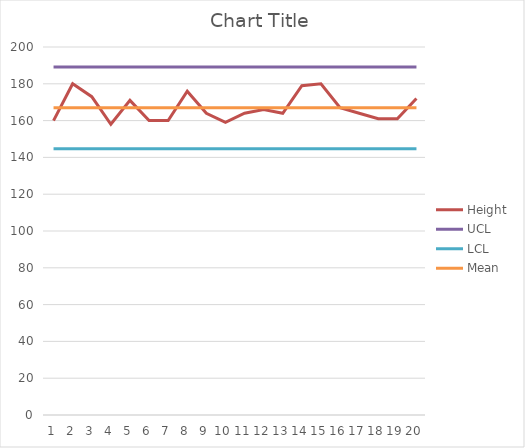
| Category | Height | UCL | LCL | Mean |
|---|---|---|---|---|
| 0 | 160 | 189.155 | 144.745 | 166.95 |
| 1 | 180 | 189.155 | 144.745 | 166.95 |
| 2 | 173 | 189.155 | 144.745 | 166.95 |
| 3 | 158 | 189.155 | 144.745 | 166.95 |
| 4 | 171 | 189.155 | 144.745 | 166.95 |
| 5 | 160 | 189.155 | 144.745 | 166.95 |
| 6 | 160 | 189.155 | 144.745 | 166.95 |
| 7 | 176 | 189.155 | 144.745 | 166.95 |
| 8 | 164 | 189.155 | 144.745 | 166.95 |
| 9 | 159 | 189.155 | 144.745 | 166.95 |
| 10 | 164 | 189.155 | 144.745 | 166.95 |
| 11 | 166 | 189.155 | 144.745 | 166.95 |
| 12 | 164 | 189.155 | 144.745 | 166.95 |
| 13 | 179 | 189.155 | 144.745 | 166.95 |
| 14 | 180 | 189.155 | 144.745 | 166.95 |
| 15 | 167 | 189.155 | 144.745 | 166.95 |
| 16 | 164 | 189.155 | 144.745 | 166.95 |
| 17 | 161 | 189.155 | 144.745 | 166.95 |
| 18 | 161 | 189.155 | 144.745 | 166.95 |
| 19 | 172 | 189.155 | 144.745 | 166.95 |